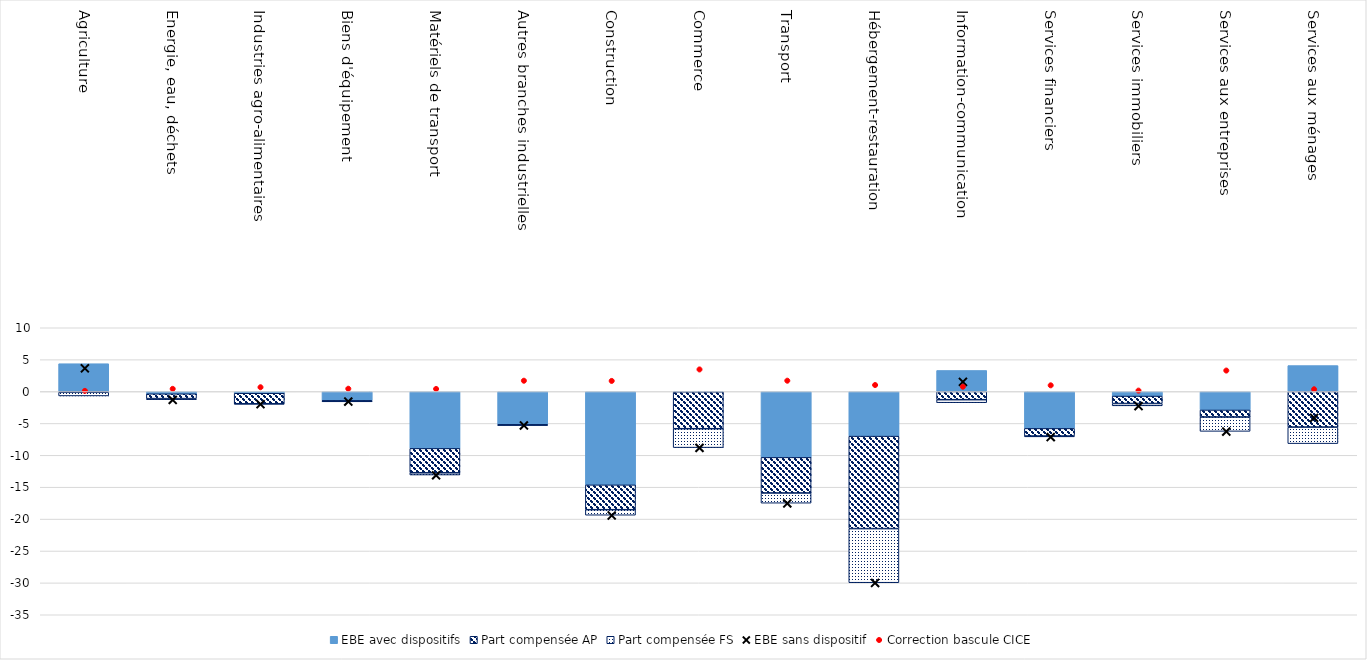
| Category | EBE avec dispositifs | Part compensée AP | Part compensée FS |
|---|---|---|---|
| Agriculture | 4.366 | -0.122 | -0.569 |
| Energie, eau, déchets | -0.36 | -0.749 | -0.17 |
| Industries agro-alimentaires | -0.269 | -1.665 | -0.015 |
| Biens d'équipement | -1.403 | -0.131 | -0.004 |
| Matériels de transport | -8.914 | -3.83 | -0.35 |
| Autres branches industrielles | -5.177 | -0.081 | -0.02 |
| Construction | -14.638 | -3.887 | -0.87 |
| Commerce | -0.052 | -5.776 | -2.966 |
| Transport | -10.323 | -5.586 | -1.599 |
| Hébergement-restauration | -6.991 | -14.501 | -8.485 |
| Information-communication | 3.305 | -1.279 | -0.472 |
| Services financiers | -5.775 | -1.206 | -0.126 |
| Services immobiliers | -0.709 | -1.169 | -0.366 |
| Services aux entreprises | -2.894 | -1.103 | -2.248 |
| Services aux ménages | 4.071 | -5.576 | -2.59 |